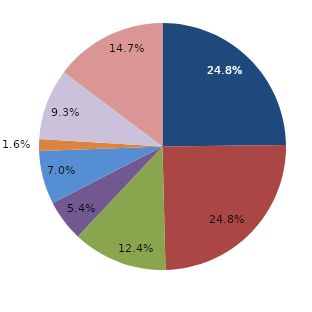
| Category | Series 0 |
|---|---|
| قبل الدخول
Before Consummation | 24.806 |
| -1 | 24.806 |
| 1 | 12.403 |
| 2 | 5.426 |
| 3 | 6.977 |
| 4 | 1.55 |
|  5 - 9 | 9.302 |
| 10+ | 14.729 |